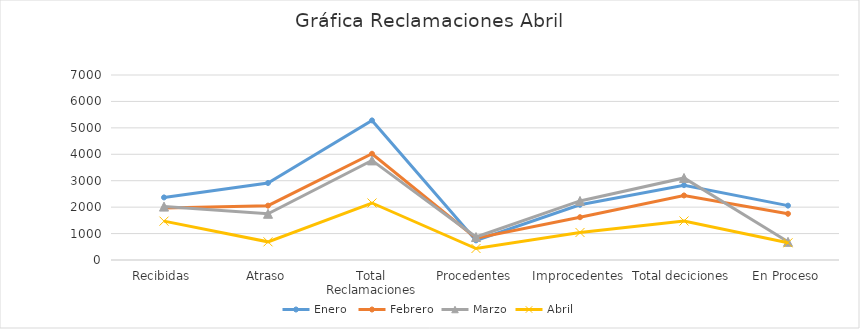
| Category | Enero  | Febrero | Marzo | Abril |
|---|---|---|---|---|
| Recibidas | 2368 | 1963 | 2020 | 1470 |
| Atraso | 2914 | 2057 | 1749 | 687 |
| Total Reclamaciones | 5282 | 4020 | 3769 | 2157 |
| Procedentes | 742 | 823 | 869 | 435 |
| Improcedentes | 2090 | 1619 | 2235 | 1041 |
| Total deciciones | 2832 | 2442 | 3104 | 1476 |
| En Proceso | 2057 | 1749 | 687 | 650 |